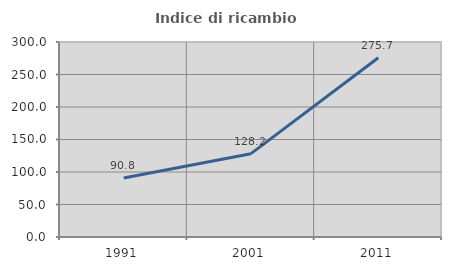
| Category | Indice di ricambio occupazionale  |
|---|---|
| 1991.0 | 90.775 |
| 2001.0 | 128.225 |
| 2011.0 | 275.712 |